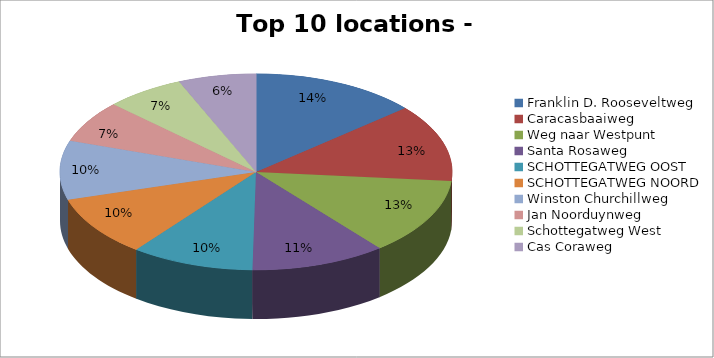
| Category | Series 0 |
|---|---|
| Franklin D. Rooseveltweg | 520 |
| Caracasbaaiweg | 484 |
| Weg naar Westpunt | 480 |
| Santa Rosaweg | 422 |
| SCHOTTEGATWEG OOST | 385 |
| SCHOTTEGATWEG NOORD | 378 |
| Winston Churchillweg | 369 |
| Jan Noorduynweg | 262 |
| Schottegatweg West | 247 |
| Cas Coraweg | 243 |